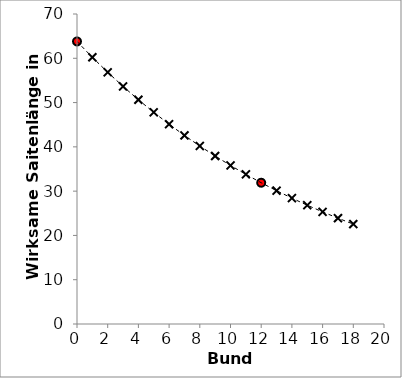
| Category | Series 0 |
|---|---|
| 0.0 | 63.8 |
| 1.0 | 60.219 |
| 2.0 | 56.839 |
| 3.0 | 53.649 |
| 4.0 | 50.638 |
| 5.0 | 47.796 |
| 6.0 | 45.113 |
| 7.0 | 42.581 |
| 8.0 | 40.191 |
| 9.0 | 37.936 |
| 10.0 | 35.807 |
| 11.0 | 33.797 |
| 12.0 | 31.9 |
| 13.0 | 30.11 |
| 14.0 | 28.42 |
| 15.0 | 26.825 |
| 16.0 | 25.319 |
| 17.0 | 23.898 |
| 18.0 | 22.557 |